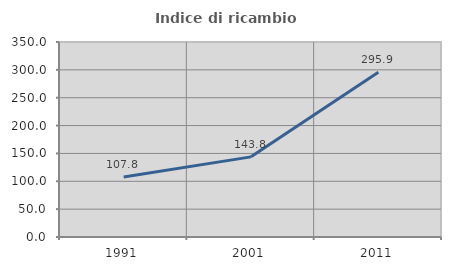
| Category | Indice di ricambio occupazionale  |
|---|---|
| 1991.0 | 107.78 |
| 2001.0 | 143.837 |
| 2011.0 | 295.913 |